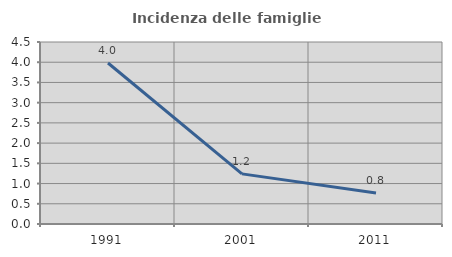
| Category | Incidenza delle famiglie numerose |
|---|---|
| 1991.0 | 3.98 |
| 2001.0 | 1.24 |
| 2011.0 | 0.766 |